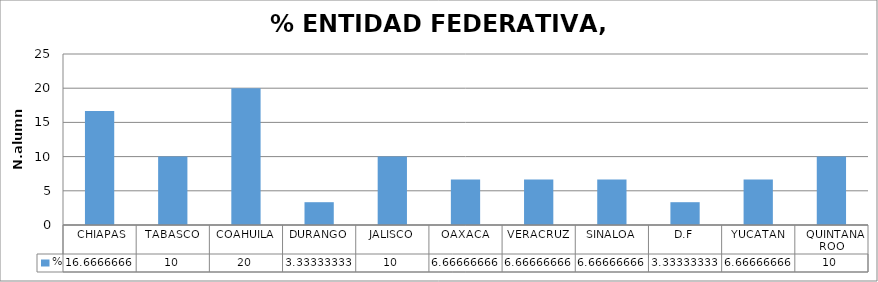
| Category | % |
|---|---|
|  CHIAPAS | 16.667 |
| TABASCO | 10 |
| COAHUILA | 20 |
| DURANGO | 3.333 |
| JALISCO | 10 |
| OAXACA | 6.667 |
| VERACRUZ | 6.667 |
| SINALOA | 6.667 |
| D.F | 3.333 |
| YUCATAN | 6.667 |
|  QUINTANA ROO | 10 |